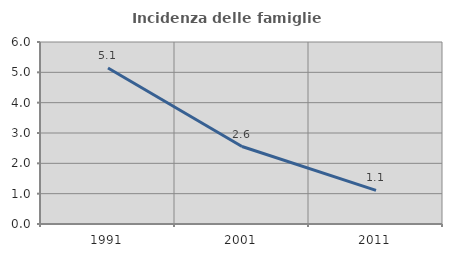
| Category | Incidenza delle famiglie numerose |
|---|---|
| 1991.0 | 5.145 |
| 2001.0 | 2.554 |
| 2011.0 | 1.106 |